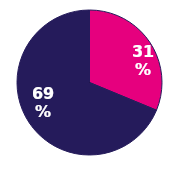
| Category | Series 0 |
|---|---|
| Male | 0.312 |
| Female | 0.688 |